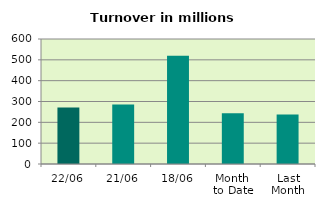
| Category | Series 0 |
|---|---|
| 22/06 | 270.704 |
| 21/06 | 285.998 |
| 18/06 | 519.245 |
| Month 
to Date | 243.662 |
| Last
Month | 237.894 |